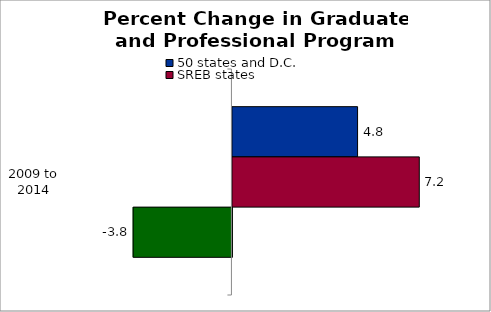
| Category | 50 states and D.C. | SREB states | State |
|---|---|---|---|
| 2009 to
2014 | 4.8 | 7.167 | -3.789 |